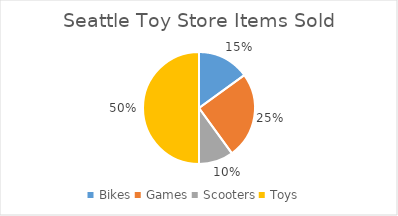
| Category | Number Items Sold |
|---|---|
| Bikes | 15 |
| Games | 25 |
| Scooters | 10 |
| Toys | 50 |